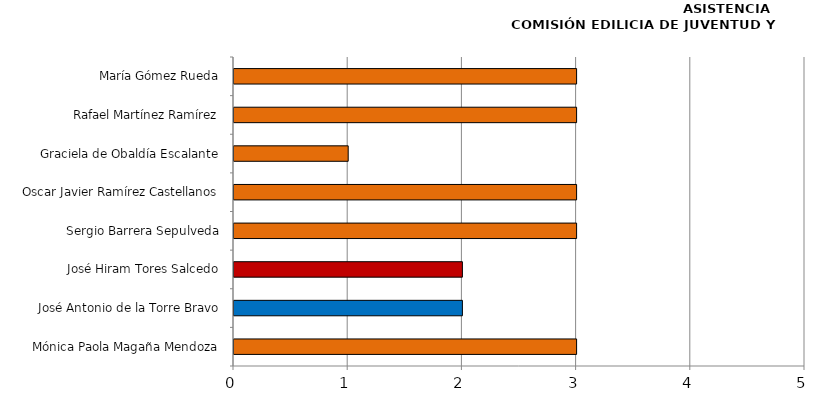
| Category | Series 0 |
|---|---|
| Mónica Paola Magaña Mendoza | 3 |
| José Antonio de la Torre Bravo | 2 |
| José Hiram Tores Salcedo | 2 |
| Sergio Barrera Sepulveda | 3 |
| Oscar Javier Ramírez Castellanos | 3 |
| Graciela de Obaldía Escalante | 1 |
| Rafael Martínez Ramírez | 3 |
| María Gómez Rueda | 3 |